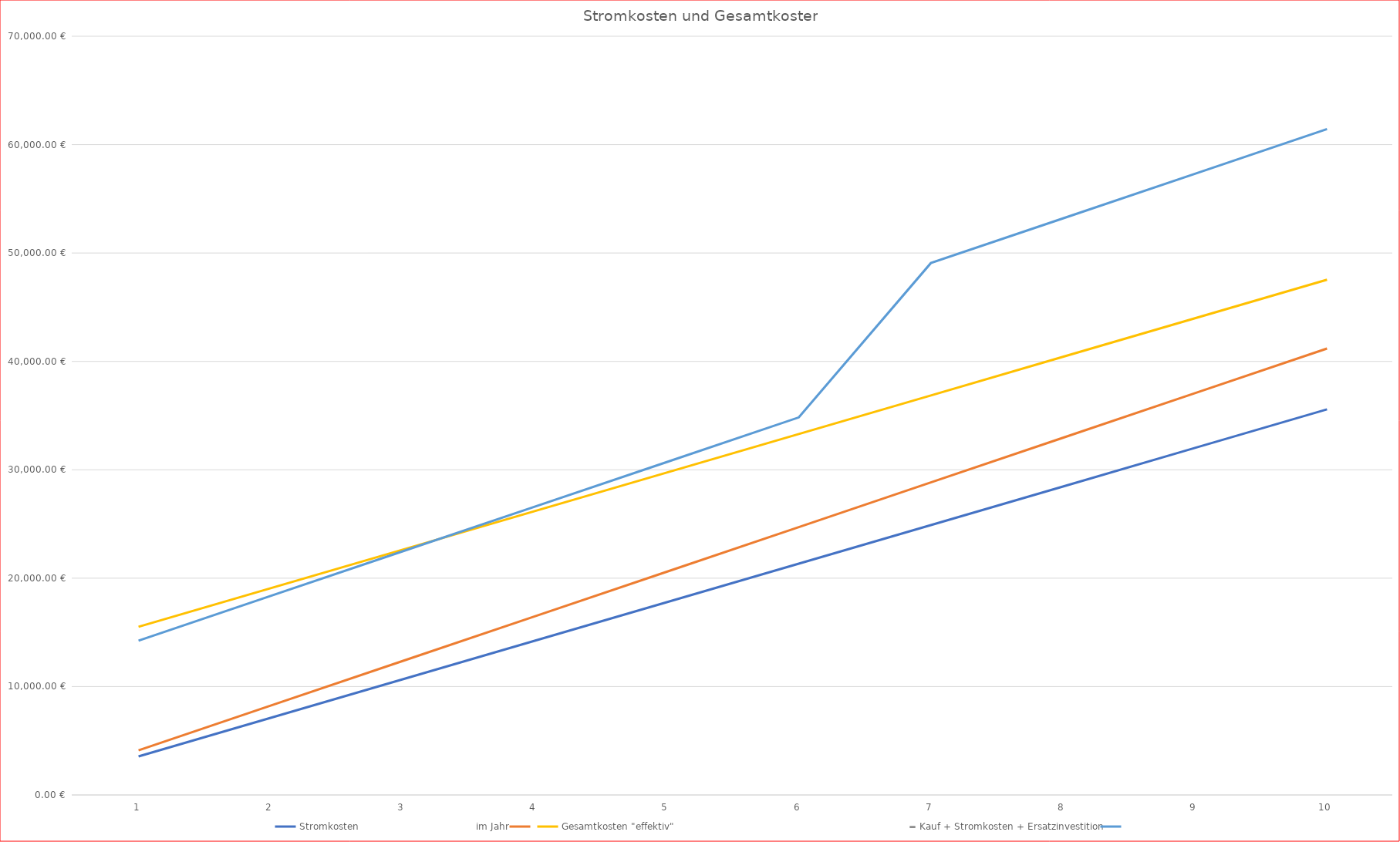
| Category | Stromkosten                                      im Jahr | Series 1 | Gesamtkosten "effektiv"                                                                            = Kauf + Stromkosten + Ersatzinvestition | Series 4 |
|---|---|---|---|---|
| 1.0 | 3557.46 | 4119.164 | 15517.46 | 14239.164 |
| 2.0 | 7114.92 | 8238.329 | 19074.92 | 18358.329 |
| 3.0 | 10672.38 | 12357.493 | 22632.38 | 22477.493 |
| 4.0 | 14229.84 | 16476.657 | 26189.84 | 26596.657 |
| 5.0 | 17787.3 | 20595.821 | 29747.3 | 30715.821 |
| 6.0 | 21344.76 | 24714.986 | 33304.76 | 34834.986 |
| 7.0 | 24902.22 | 28834.15 | 36862.22 | 49074.15 |
| 8.0 | 28459.68 | 32953.314 | 40419.68 | 53193.314 |
| 9.0 | 32017.141 | 37072.479 | 43977.141 | 57312.479 |
| 10.0 | 35574.601 | 41191.643 | 47534.601 | 61431.643 |